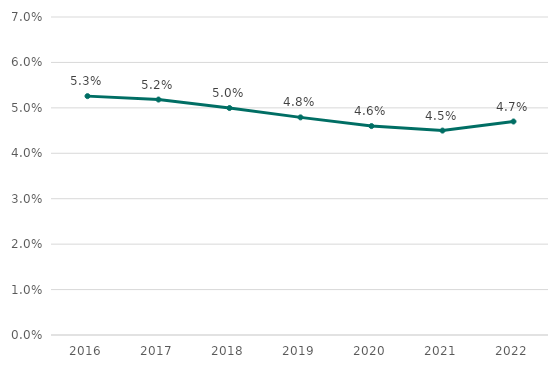
| Category | Yield |
|---|---|
| 2016.0 | 0.053 |
| 2017.0 | 0.052 |
| 2018.0 | 0.05 |
| 2019.0 | 0.048 |
| 2020.0 | 0.046 |
| 2021.0 | 0.045 |
| 2022.0 | 0.047 |